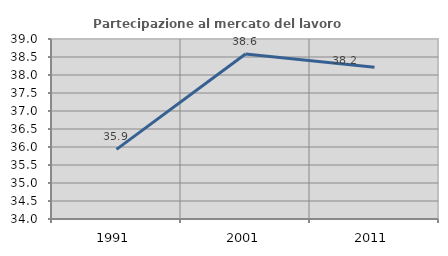
| Category | Partecipazione al mercato del lavoro  femminile |
|---|---|
| 1991.0 | 35.933 |
| 2001.0 | 38.583 |
| 2011.0 | 38.213 |